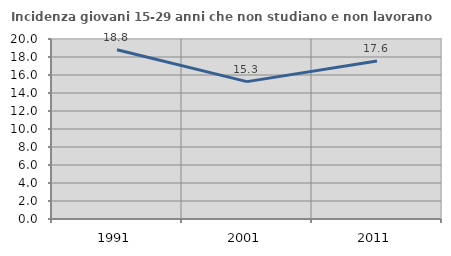
| Category | Incidenza giovani 15-29 anni che non studiano e non lavorano  |
|---|---|
| 1991.0 | 18.803 |
| 2001.0 | 15.264 |
| 2011.0 | 17.563 |